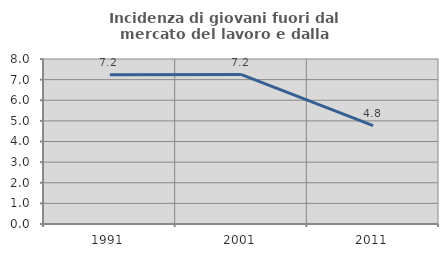
| Category | Incidenza di giovani fuori dal mercato del lavoro e dalla formazione  |
|---|---|
| 1991.0 | 7.242 |
| 2001.0 | 7.243 |
| 2011.0 | 4.772 |